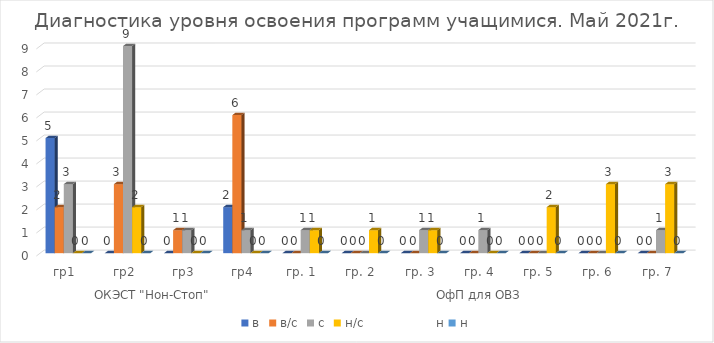
| Category | в | в/с | с | н/с                  н | н |
|---|---|---|---|---|---|
| 0 | 5 | 2 | 3 | 0 | 0 |
| 1 | 0 | 3 | 9 | 2 | 0 |
| 2 | 0 | 1 | 1 | 0 | 0 |
| 3 | 2 | 6 | 1 | 0 | 0 |
| 4 | 0 | 0 | 1 | 1 | 0 |
| 5 | 0 | 0 | 0 | 1 | 0 |
| 6 | 0 | 0 | 1 | 1 | 0 |
| 7 | 0 | 0 | 1 | 0 | 0 |
| 8 | 0 | 0 | 0 | 2 | 0 |
| 9 | 0 | 0 | 0 | 3 | 0 |
| 10 | 0 | 0 | 1 | 3 | 0 |